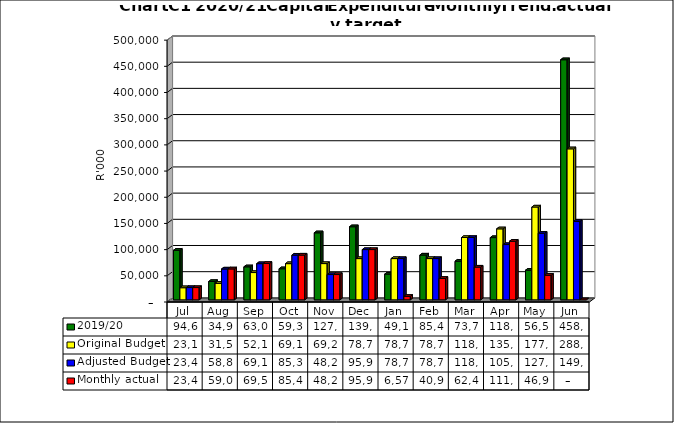
| Category | 2019/20 | Original Budget | Adjusted Budget | Monthly actual |
|---|---|---|---|---|
| Jul | 94661917.305 | 23146604.34 | 23449713.353 | 23449713.35 |
| Aug | 34997120.505 | 31506119.635 | 58840827.869 | 59042634.492 |
| Sep | 63024484.609 | 52101276.725 | 69126894.335 | 69541260.479 |
| Oct | 59349467.812 | 69111701.558 | 85314622.258 | 85425681.67 |
| Nov | 127966561.363 | 69234670.496 | 48292769.82 | 48292769.81 |
| Dec | 139558296.79 | 78739947.961 | 95953914.122 | 95978639.303 |
| Jan | 49120173.272 | 78780743.315 | 78780754.377 | 6570769.858 |
| Feb | 85478228.192 | 78780743.315 | 78780743.315 | 40968693.029 |
| Mar | 73737271.004 | 118994885.383 | 118994902.982 | 62477125.802 |
| Apr | 118845502.652 | 135539662.905 | 105539683.133 | 111884524.236 |
| May | 56523169.68 | 177230590.985 | 127230617.567 | 46922259.416 |
| Jun | 458444574.171 | 288331735.384 | 149575587.23 | 0 |